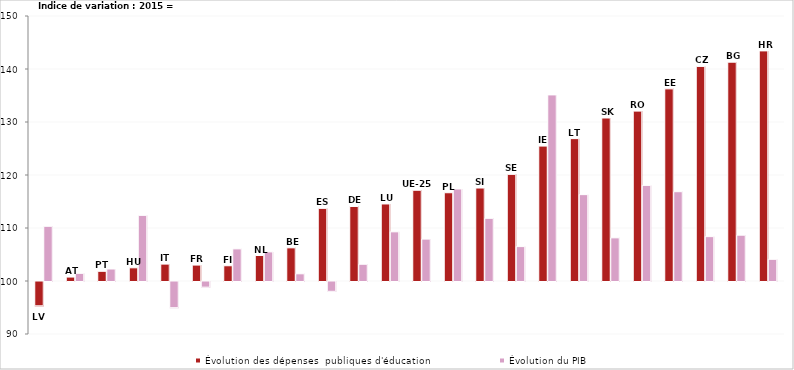
| Category | Évolution des dépenses  publiques d'éducation | Évolution du PIB  |
|---|---|---|
| LV | 95.418 | 110.322 |
| AT | 100.744 | 101.444 |
| PT | 101.828 | 102.262 |
| HU | 102.488 | 112.382 |
| IT | 103.192 | 95.061 |
| FR | 103.006 | 98.931 |
| FI | 102.877 | 106.059 |
| NL | 104.81 | 105.489 |
| BE | 106.258 | 101.357 |
| ES | 113.704 | 98.146 |
| DE | 114.06 | 103.16 |
| LU | 114.535 | 109.277 |
| UE-25 | 117.122 | 107.905 |
| PL | 116.652 | 117.364 |
| SI | 117.544 | 111.827 |
| SE | 120.119 | 106.491 |
| IE | 125.455 | 135.11 |
| LT | 126.862 | 116.295 |
| SK | 130.756 | 108.142 |
| RO | 132.052 | 118.038 |
| EE | 136.255 | 116.848 |
| CZ | 140.492 | 108.371 |
| BG | 141.286 | 108.641 |
| HR | 143.416 | 104.089 |